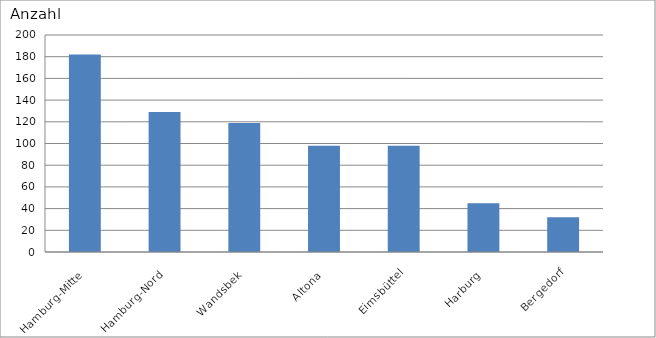
| Category | Hamburg-Mitte |
|---|---|
| Hamburg-Mitte | 182 |
| Hamburg-Nord | 129 |
| Wandsbek | 119 |
| Altona | 98 |
| Eimsbüttel | 98 |
| Harburg | 45 |
| Bergedorf | 32 |